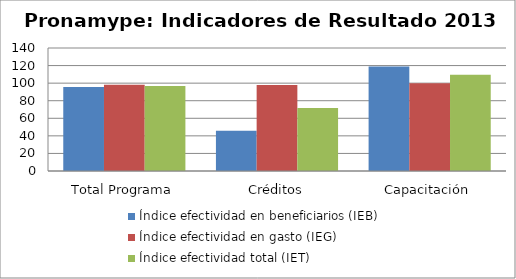
| Category | Índice efectividad en beneficiarios (IEB) | Índice efectividad en gasto (IEG)  | Índice efectividad total (IET) |
|---|---|---|---|
| Total Programa | 95.522 | 98.137 | 96.83 |
| Créditos | 45.907 | 97.744 | 71.826 |
| Capacitación | 119.04 | 99.838 | 109.439 |